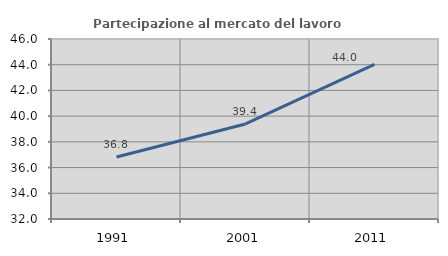
| Category | Partecipazione al mercato del lavoro  femminile |
|---|---|
| 1991.0 | 36.816 |
| 2001.0 | 39.394 |
| 2011.0 | 44.027 |